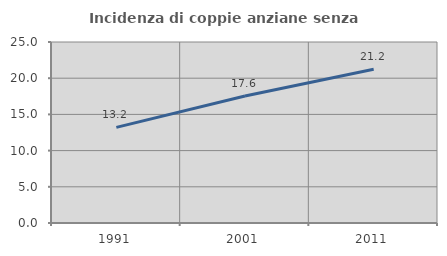
| Category | Incidenza di coppie anziane senza figli  |
|---|---|
| 1991.0 | 13.209 |
| 2001.0 | 17.552 |
| 2011.0 | 21.228 |